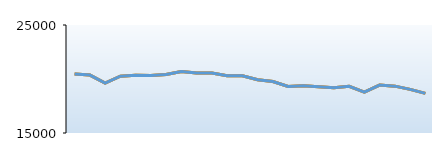
| Category | Mark Harris |
|---|---|
| Jan-16 | 20471 |
| Feb-16 | 20364 |
| Mar-16 | 19615 |
| Apr-16 | 20257 |
| May-16 | 20337 |
| Jun-16 | 20325 |
| Jul-16 | 20419 |
| Aug-16 | 20694 |
| Sep-16 | 20554 |
| Oct-16 | 20564 |
| Nov-16 | 20295 |
| Dec-16 | 20294 |
| Jan-17 | 19925 |
| Feb-17 | 19762 |
| Mar-17 | 19311 |
| Apr-17 | 19365 |
| May-17 | 19278 |
| Jun-17 | 19185 |
| Jul-17 | 19321 |
| Aug-17 | 18787 |
| Sep-17 | 19436 |
| Oct-17 | 19339 |
| Nov-17 | 19037 |
| Dec-17 | 18669 |